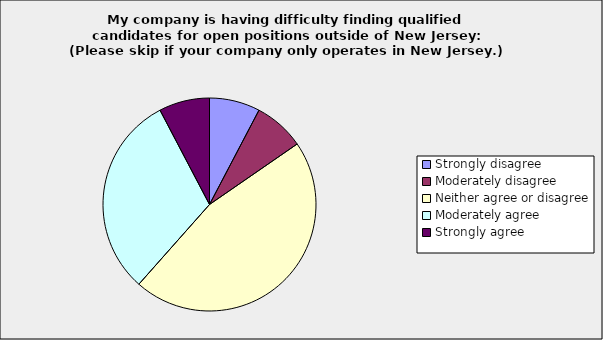
| Category | Series 0 |
|---|---|
| Strongly disagree | 0.077 |
| Moderately disagree | 0.077 |
| Neither agree or disagree | 0.462 |
| Moderately agree | 0.308 |
| Strongly agree | 0.077 |